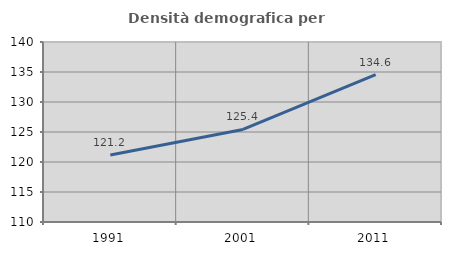
| Category | Densità demografica |
|---|---|
| 1991.0 | 121.18 |
| 2001.0 | 125.424 |
| 2011.0 | 134.577 |